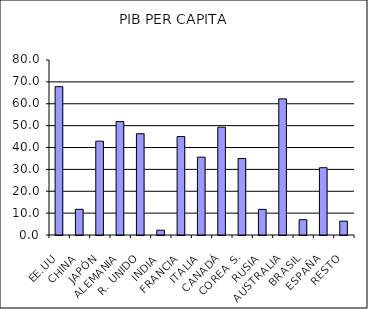
| Category | Series 0 |
|---|---|
| EE.UU | 67.808 |
| CHINA | 11.747 |
| JAPÓN | 42.887 |
| ALEMANIA | 51.849 |
| R. UNIDO | 46.296 |
| INDIA | 2.195 |
| FRANCIA | 44.992 |
| ITALIA | 35.574 |
| CANADÁ | 49.293 |
| COREA S. | 34.952 |
| RUSIA | 11.711 |
| AUSTRALIA | 62.231 |
| BRASIL | 7.008 |
| ESPAÑA | 30.758 |
| RESTO | 6.322 |